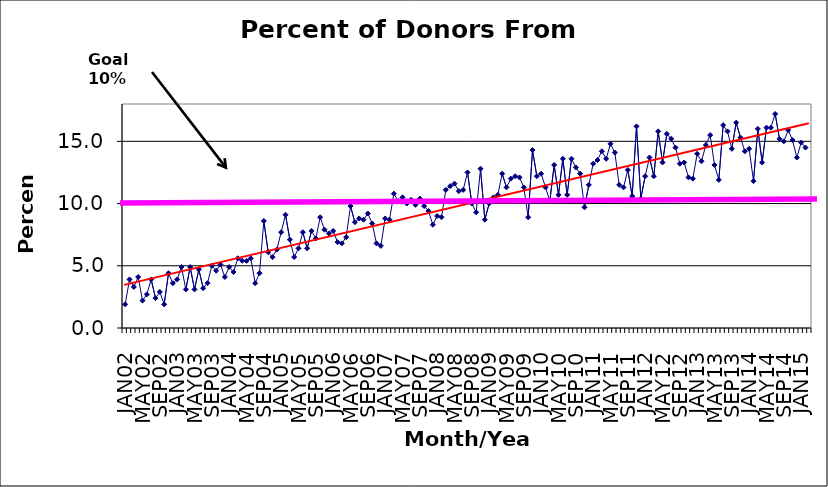
| Category | Series 0 |
|---|---|
| JAN02 | 1.9 |
| FEB02 | 3.9 |
| MAR02 | 3.3 |
| APR02 | 4.1 |
| MAY02 | 2.2 |
| JUN02 | 2.7 |
| JUL02 | 3.9 |
| AUG02 | 2.4 |
| SEP02 | 2.9 |
| OCT02 | 1.9 |
| NOV02 | 4.4 |
| DEC02 | 3.6 |
| JAN03 | 3.9 |
| FEB03 | 4.9 |
| MAR03 | 3.1 |
| APR03 | 4.9 |
| MAY03 | 3.1 |
| JUN03 | 4.7 |
| JUL03 | 3.2 |
| AUG03 | 3.6 |
| SEP03 | 5 |
| OCT03 | 4.6 |
| NOV03 | 5.1 |
| DEC03 | 4.1 |
| JAN04 | 4.9 |
| FEB04 | 4.5 |
| MAR04 | 5.6 |
| APR04 | 5.4 |
| MAY04 | 5.4 |
| JUN04 | 5.6 |
| JUL04 | 3.6 |
| AUG04 | 4.4 |
| SEP04 | 8.6 |
| OCT04 | 6.1 |
| NOV04 | 5.7 |
| DEC04 | 6.3 |
| JAN05 | 7.7 |
| FEB05 | 9.1 |
| MAR05 | 7.1 |
| APR05 | 5.7 |
| MAY05 | 6.4 |
| JUN05 | 7.7 |
| JUL05 | 6.4 |
| AUG05 | 7.8 |
| SEP05 | 7.2 |
| OCT05 | 8.9 |
| NOV05 | 7.9 |
| DEC05 | 7.6 |
| JAN06 | 7.8 |
| FEB06 | 6.9 |
| MAR06 | 6.8 |
| APR06 | 7.3 |
| MAY06 | 9.8 |
| JUN06 | 8.5 |
| JUL06 | 8.8 |
| AUG06 | 8.7 |
| SEP06 | 9.2 |
| OCT06 | 8.4 |
| NOV06 | 6.8 |
| DEC06 | 6.6 |
| JAN07 | 8.8 |
| FEB07 | 8.7 |
| MAR07 | 10.8 |
| APR07 | 10.2 |
| MAY07 | 10.5 |
| JUN07 | 10 |
| JUL07 | 10.3 |
| AUG07 | 9.9 |
| SEP07 | 10.4 |
| OCT07 | 9.8 |
| NOV07 | 9.4 |
| DEC07 | 8.3 |
| JAN08 | 9 |
| FEB08 | 8.9 |
| MAR08 | 11.1 |
| APR08 | 11.4 |
| MAY08 | 11.6 |
| JUN08 | 11 |
| JUL08 | 11.1 |
| AUG08 | 12.5 |
| SEP08 | 10 |
| OCT08 | 9.3 |
| NOV08 | 12.8 |
| DEC08 | 8.7 |
| JAN09 | 10 |
| FEB09 | 10.5 |
| MAR09 | 10.7 |
| APR09 | 12.4 |
| MAY09 | 11.3 |
| JUN09 | 12 |
| JUL09 | 12.2 |
| AUG09 | 12.1 |
| SEP09 | 11.3 |
| OCT09 | 8.9 |
| NOV09 | 14.3 |
| DEC09 | 12.2 |
| JAN10 | 12.4 |
| FEB10 | 11.3 |
| MAR10 | 10.2 |
| APR10 | 13.1 |
| MAY10 | 10.7 |
| JUN10 | 13.6 |
| JUL10 | 10.7 |
| AUG10 | 13.6 |
| SEP10 | 12.9 |
| OCT10 | 12.4 |
| NOV10 | 9.7 |
| DEC10 | 11.5 |
| JAN11 | 13.2 |
| FEB11 | 13.5 |
| MAR11 | 14.2 |
| APR11 | 13.6 |
| MAY11 | 14.8 |
| JUN11 | 14.1 |
| JUL11 | 11.5 |
| AUG11 | 11.3 |
| SEP11 | 12.7 |
| OCT11 | 10.6 |
| NOV11 | 16.2 |
| DEC11 | 10.4 |
| JAN12 | 12.2 |
| FEB12 | 13.7 |
| MAR12 | 12.2 |
| APR12 | 15.8 |
| MAY12 | 13.3 |
| JUN12 | 15.6 |
| JUL12 | 15.2 |
| AUG12 | 14.5 |
| SEP12 | 13.2 |
| OCT12 | 13.3 |
| NOV12 | 12.1 |
| DEC12 | 12 |
| JAN13 | 14 |
| FEB13 | 13.4 |
| MAR13 | 14.7 |
| APR13 | 15.5 |
| MAY13 | 13.1 |
| JUN13 | 11.9 |
| JUL13 | 16.3 |
| AUG13 | 15.8 |
| SEP13 | 14.4 |
| OCT13 | 16.5 |
| NOV13 | 15.3 |
| DEC13 | 14.2 |
| JAN14 | 14.4 |
| FEB14 | 11.8 |
| MAR14 | 16 |
| APR14 | 13.3 |
| MAY14 | 16.1 |
| JUN14 | 16.1 |
| JUL14 | 17.2 |
| AUG14 | 15.2 |
| SEP14 | 15 |
| OCT14 | 15.9 |
| NOV14 | 15.1 |
| DEC14 | 13.7 |
| JAN15 | 14.9 |
| FEB15 | 14.5 |